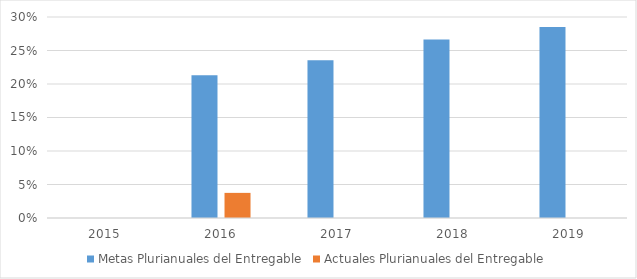
| Category | Metas Plurianuales del Entregable | Actuales Plurianuales del Entregable |
|---|---|---|
| 2015.0 | 0 | 0 |
| 2016.0 | 0.213 | 0.038 |
| 2017.0 | 0.235 | 0 |
| 2018.0 | 0.266 | 0 |
| 2019.0 | 0.285 | 0 |